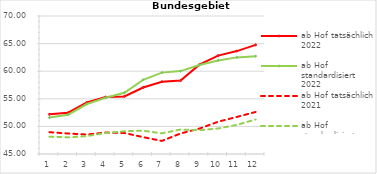
| Category | ab Hof tatsächlich 2022 | ab Hof standardisiert 2022 | ab Hof tatsächlich 2021 | ab Hof standardisiert 2021 |
|---|---|---|---|---|
| 0 | 52.183 | 51.603 | 48.957 | 48.146 |
| 1 | 52.48 | 52.123 | 48.706 | 48.006 |
| 2 | 54.35 | 54.055 | 48.532 | 48.24 |
| 3 | 55.313 | 55.201 | 48.887 | 48.809 |
| 4 | 55.433 | 56.104 | 48.801 | 49.12 |
| 5 | 57.041 | 58.436 | 48.058 | 49.225 |
| 6 | 58.089 | 59.743 | 47.365 | 48.74 |
| 7 | 58.313 | 60.017 | 48.722 | 49.439 |
| 8 | 61.186 | 61.126 | 49.599 | 49.312 |
| 9 | 62.829 | 61.952 | 50.845 | 49.618 |
| 10 | 63.645 | 62.503 | 51.717 | 50.277 |
| 11 | 64.771 | 62.726 | 52.615 | 51.254 |